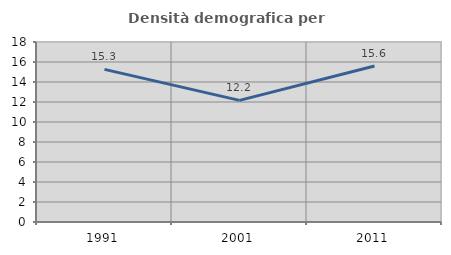
| Category | Densità demografica |
|---|---|
| 1991.0 | 15.261 |
| 2001.0 | 12.164 |
| 2011.0 | 15.599 |